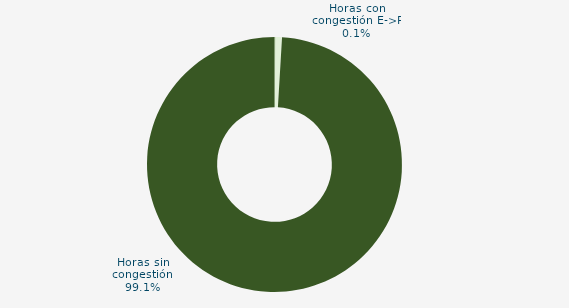
| Category | Horas con congestión E->P |
|---|---|
| Horas con congestión E->P | 0.135 |
| Horas con congestión P->E | 0.808 |
| Horas sin congestión | 99.058 |